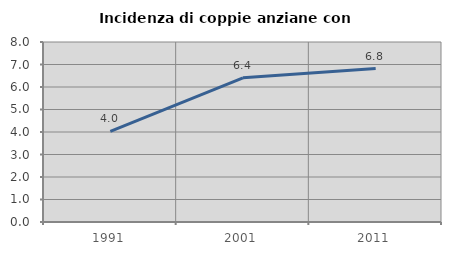
| Category | Incidenza di coppie anziane con figli |
|---|---|
| 1991.0 | 4.023 |
| 2001.0 | 6.41 |
| 2011.0 | 6.818 |